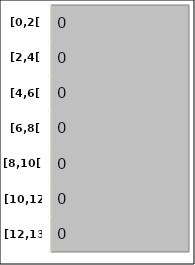
| Category | Ressources |
|---|---|
| [0,2[ | 0 |
| [2,4[ | 0 |
| [4,6[ | 0 |
| [6,8[ | 0 |
| [8,10[ | 0 |
| [10,12[ | 0 |
| [12,13[ | 0 |